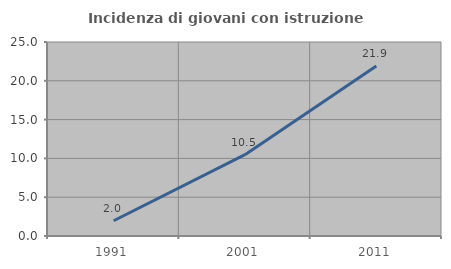
| Category | Incidenza di giovani con istruzione universitaria |
|---|---|
| 1991.0 | 1.961 |
| 2001.0 | 10.48 |
| 2011.0 | 21.916 |